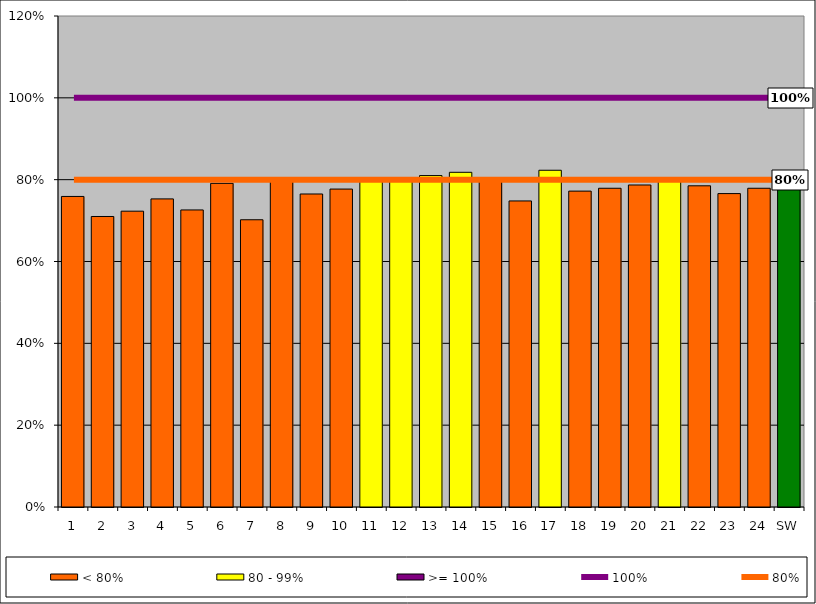
| Category | < 80% | 80 - 99% | >= 100% |
|---|---|---|---|
| 1 | 0.759 | 0 | 0 |
| 2 | 0.71 | 0 | 0 |
| 3 | 0.723 | 0 | 0 |
| 4 | 0.753 | 0 | 0 |
| 5 | 0.726 | 0 | 0 |
| 6 | 0.791 | 0 | 0 |
| 7 | 0.702 | 0 | 0 |
| 8 | 0.798 | 0 | 0 |
| 9 | 0.765 | 0 | 0 |
| 10 | 0.777 | 0 | 0 |
| 11 | 0 | 0.8 | 0 |
| 12 | 0 | 0.805 | 0 |
| 13 | 0 | 0.81 | 0 |
| 14 | 0 | 0.818 | 0 |
| 15 | 0.797 | 0 | 0 |
| 16 | 0.748 | 0 | 0 |
| 17 | 0 | 0.823 | 0 |
| 18 | 0.772 | 0 | 0 |
| 19 | 0.779 | 0 | 0 |
| 20 | 0.787 | 0 | 0 |
| 21 | 0 | 0.802 | 0 |
| 22 | 0.785 | 0 | 0 |
| 23 | 0.766 | 0 | 0 |
| 24 | 0.779 | 0 | 0 |
| SW | 0.788 | 0 | 0 |